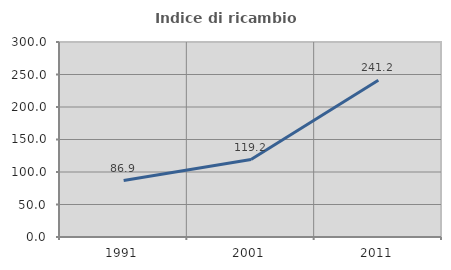
| Category | Indice di ricambio occupazionale  |
|---|---|
| 1991.0 | 86.863 |
| 2001.0 | 119.231 |
| 2011.0 | 241.176 |